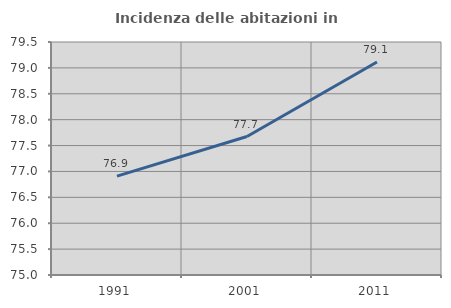
| Category | Incidenza delle abitazioni in proprietà  |
|---|---|
| 1991.0 | 76.91 |
| 2001.0 | 77.675 |
| 2011.0 | 79.114 |